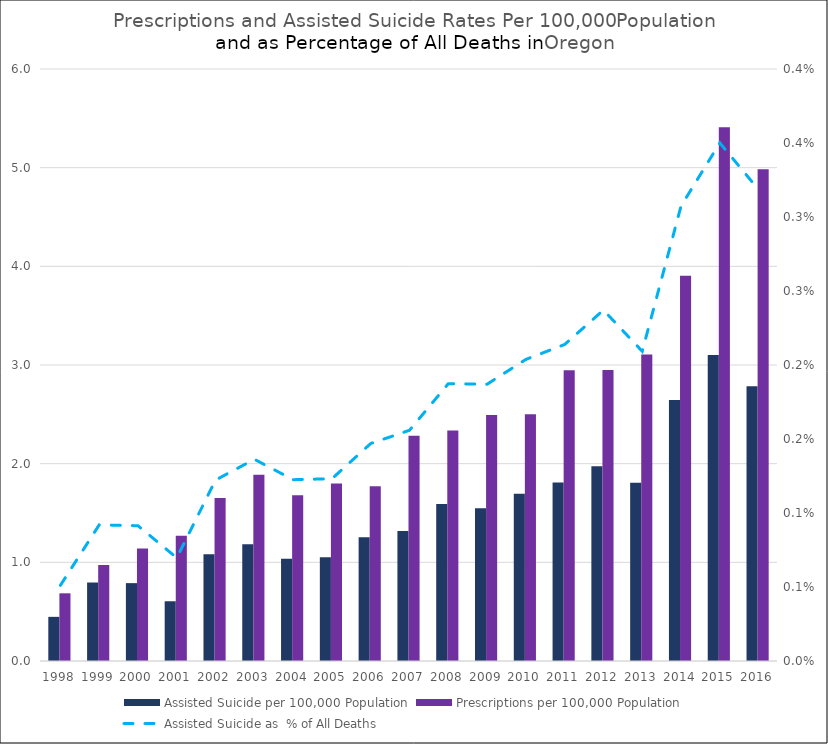
| Category | Assisted Suicide per 100,000 Population | Prescriptions per 100,000 Population |
|---|---|---|
| 1998 | 0.447 | 0.686 |
| 1999 | 0.796 | 0.972 |
| 2000 | 0.789 | 1.14 |
| 2001 | 0.606 | 1.269 |
| 2002 | 1.082 | 1.651 |
| 2003 | 1.184 | 1.889 |
| 2004 | 1.037 | 1.681 |
| 2005 | 1.052 | 1.799 |
| 2006 | 1.253 | 1.771 |
| 2007 | 1.316 | 2.283 |
| 2008 | 1.592 | 2.335 |
| 2009 | 1.549 | 2.494 |
| 2010 | 1.694 | 2.502 |
| 2011 | 1.81 | 2.948 |
| 2012 | 1.975 | 2.95 |
| 2013 | 1.808 | 3.106 |
| 2014 | 2.645 | 3.904 |
| 2015 | 3.103 | 5.411 |
| 2016 | 2.785 | 4.984 |